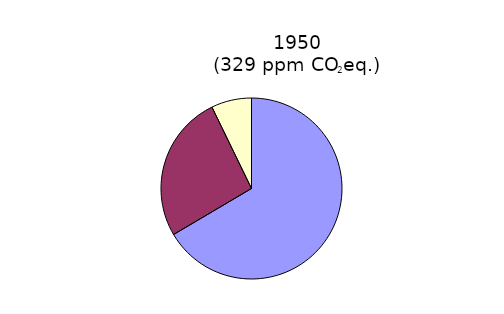
| Category | 1950 |
|---|---|
| CO2 | 0.595 |
| CH4 | 0.235 |
| N2O | 0.064 |
| PFC,HFC,SF6 | 0 |
| Montreal gasses | 0 |